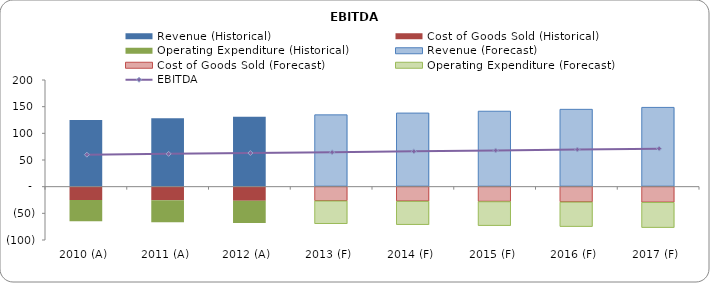
| Category | Revenue (Historical) | Cost of Goods Sold (Historical) | Operating Expenditure (Historical) | Revenue (Forecast) | Cost of Goods Sold (Forecast) | Operating Expenditure (Forecast) |
|---|---|---|---|---|---|---|
| 2010 (A)  | 125 | -25 | -40 | 0 | 0 | 0 |
| 2011 (A)  | 128.125 | -25.625 | -41 | 0 | 0 | 0 |
| 2012 (A)  | 131.328 | -26.266 | -42.025 | 0 | 0 | 0 |
| 2013 (F)  | 0 | 0 | 0 | 134.611 | -26.922 | -43.076 |
| 2014 (F)  | 0 | 0 | 0 | 137.977 | -27.595 | -44.153 |
| 2015 (F)  | 0 | 0 | 0 | 141.426 | -28.285 | -45.256 |
| 2016 (F)  | 0 | 0 | 0 | 144.962 | -28.992 | -46.388 |
| 2017 (F)  | 0 | 0 | 0 | 148.586 | -29.717 | -47.547 |